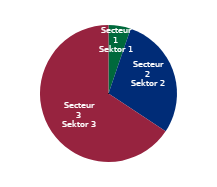
| Category | Series 0 |
|---|---|
| Secteur 1
Sektor 1 | 6216.152 |
| Secteur 2
Sektor 2 | 34515.726 |
| Secteur 3
Sektor 3 | 77955.201 |